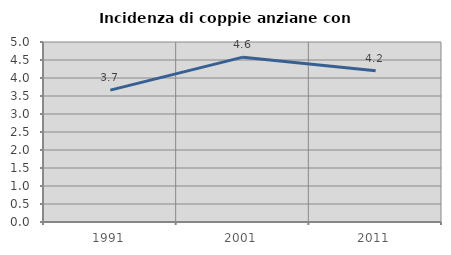
| Category | Incidenza di coppie anziane con figli |
|---|---|
| 1991.0 | 3.662 |
| 2001.0 | 4.579 |
| 2011.0 | 4.203 |